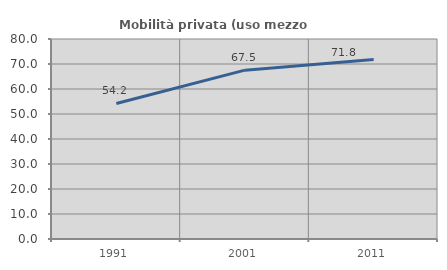
| Category | Mobilità privata (uso mezzo privato) |
|---|---|
| 1991.0 | 54.225 |
| 2001.0 | 67.538 |
| 2011.0 | 71.821 |